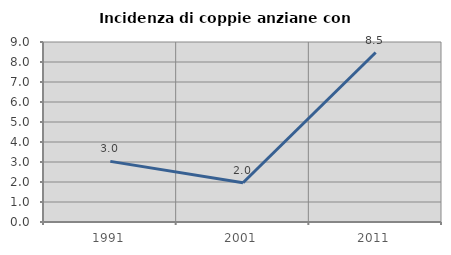
| Category | Incidenza di coppie anziane con figli |
|---|---|
| 1991.0 | 3.03 |
| 2001.0 | 1.961 |
| 2011.0 | 8.475 |